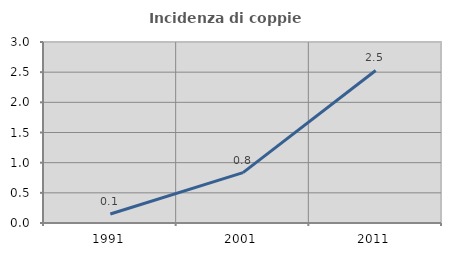
| Category | Incidenza di coppie miste |
|---|---|
| 1991.0 | 0.149 |
| 2001.0 | 0.835 |
| 2011.0 | 2.528 |